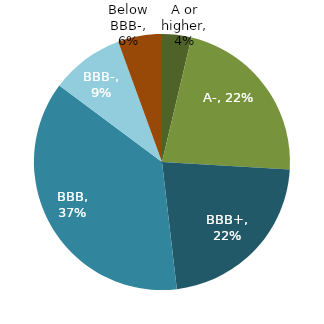
| Category | Series 0 |
|---|---|
| A or higher | 0.037 |
| A- | 0.222 |
| BBB+ | 0.222 |
| BBB | 0.37 |
| BBB- | 0.093 |
| Below BBB- | 0.056 |